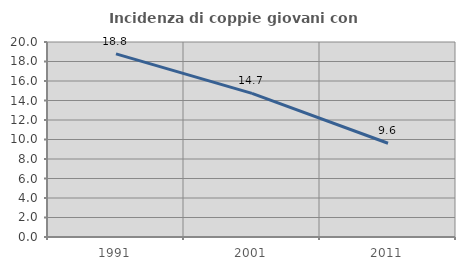
| Category | Incidenza di coppie giovani con figli |
|---|---|
| 1991.0 | 18.784 |
| 2001.0 | 14.728 |
| 2011.0 | 9.615 |